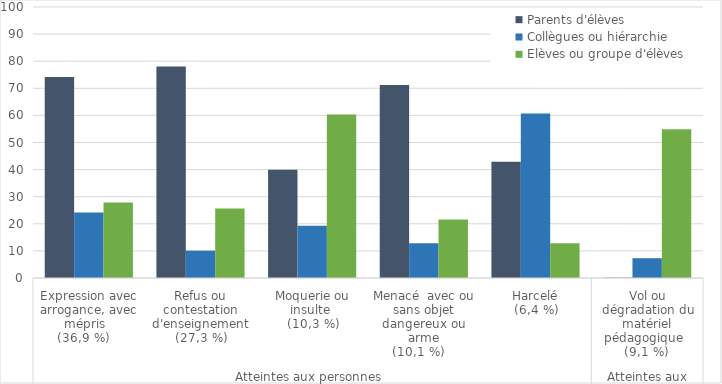
| Category | Parents d'élèves  | Collègues ou hiérarchie | Elèves ou groupe d'élèves |
|---|---|---|---|
| 0 | 74.2 | 24.2 | 27.9 |
| 1 | 78 | 10.1 | 25.6 |
| 2 | 39.9 | 19.3 | 60.3 |
| 3 | 71.2 | 12.8 | 21.6 |
| 4 | 42.9 | 60.7 | 12.8 |
| 5 | 0.1 | 7.3 | 54.9 |